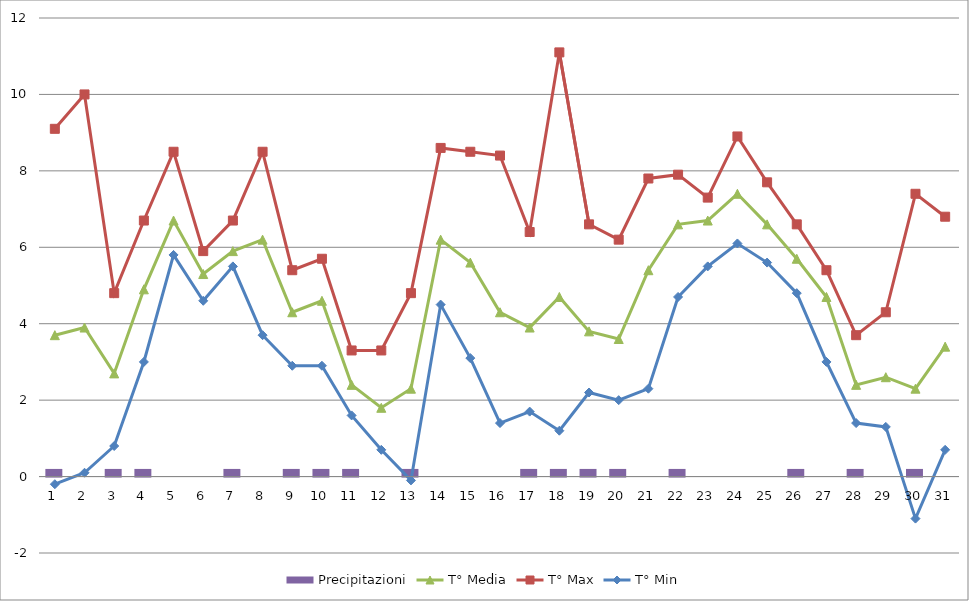
| Category | Precipitazioni |
|---|---|
| 0 | 0.2 |
| 1 | 0 |
| 2 | 0.2 |
| 3 | 0.2 |
| 4 | 0 |
| 5 | 0 |
| 6 | 0.2 |
| 7 | 0 |
| 8 | 0.2 |
| 9 | 0.2 |
| 10 | 0.2 |
| 11 | 0 |
| 12 | 0.2 |
| 13 | 0 |
| 14 | 0 |
| 15 | 0 |
| 16 | 0.2 |
| 17 | 0.2 |
| 18 | 0.2 |
| 19 | 0.2 |
| 20 | 0 |
| 21 | 0.2 |
| 22 | 0 |
| 23 | 0 |
| 24 | 0 |
| 25 | 0.2 |
| 26 | 0 |
| 27 | 0.2 |
| 28 | 0 |
| 29 | 0.2 |
| 30 | 0 |